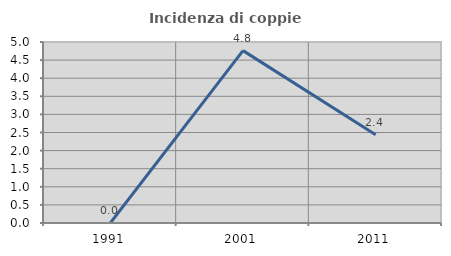
| Category | Incidenza di coppie miste |
|---|---|
| 1991.0 | 0 |
| 2001.0 | 4.762 |
| 2011.0 | 2.439 |